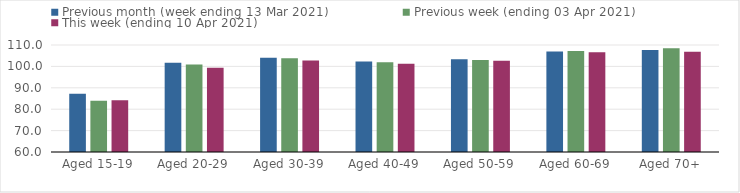
| Category | Previous month (week ending 13 Mar 2021) | Previous week (ending 03 Apr 2021) | This week (ending 10 Apr 2021) |
|---|---|---|---|
| Aged 15-19 | 87.19 | 83.99 | 84.2 |
| Aged 20-29 | 101.74 | 100.91 | 99.36 |
| Aged 30-39 | 104.08 | 103.78 | 102.72 |
| Aged 40-49 | 102.32 | 101.93 | 101.29 |
| Aged 50-59 | 103.31 | 103.03 | 102.63 |
| Aged 60-69 | 106.94 | 107.25 | 106.57 |
| Aged 70+ | 107.68 | 108.5 | 106.82 |